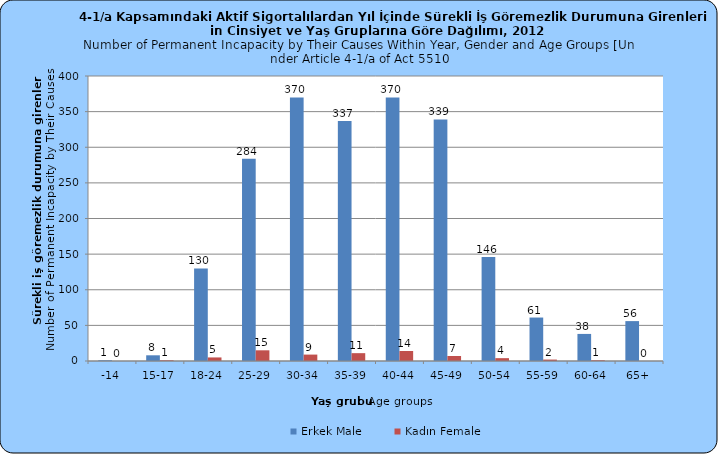
| Category | Erkek Male | Kadın Female |
|---|---|---|
| -14 | 1 | 0 |
| 15-17 | 8 | 1 |
| 18-24 | 130 | 5 |
| 25-29 | 284 | 15 |
| 30-34 | 370 | 9 |
| 35-39 | 337 | 11 |
| 40-44 | 370 | 14 |
| 45-49 | 339 | 7 |
| 50-54 | 146 | 4 |
| 55-59 | 61 | 2 |
| 60-64 | 38 | 1 |
| 65+ | 56 | 0 |